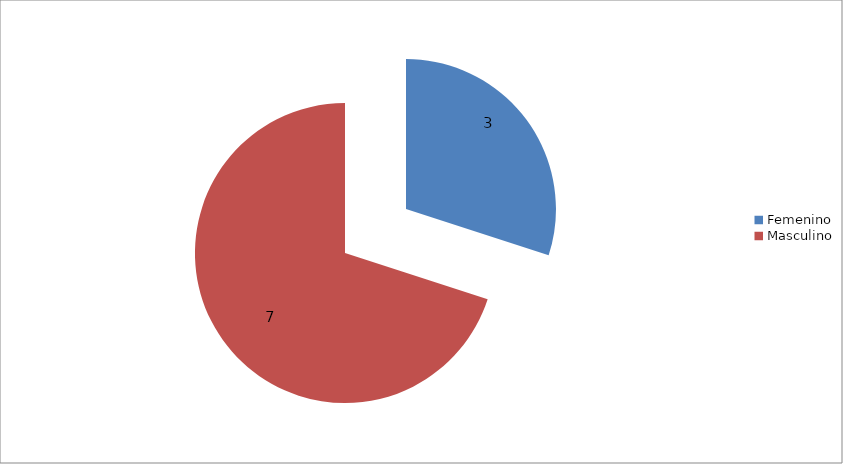
| Category | Series 0 |
|---|---|
| Femenino | 3 |
| Masculino | 7 |